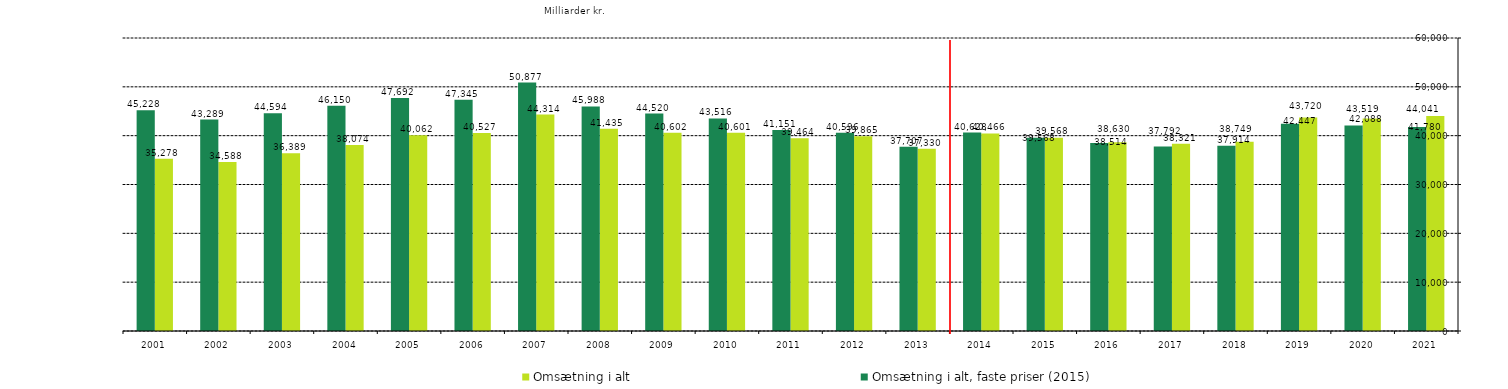
| Category | Omsætning i alt | Omsætning i alt, faste priser (2015) |
|---|---|---|
| 2021.0 | 44040.703 | 41780.048 |
| 2020.0 | 43518.684 | 42087.702 |
| 2019.0 | 43720.193 | 42446.789 |
| 2018.0 | 38748.559 | 37914.441 |
| 2017.0 | 38320.677 | 37791.595 |
| 2016.0 | 38630.023 | 38514.48 |
| 2015.0 | 39568.469 | 39568.469 |
| 2014.0 | 40465.647 | 40628.16 |
| 2013.0 | 37330.068 | 37707.139 |
| 2012.0 | 39864.928 | 40595.65 |
| 2011.0 | 39464.007 | 41151.206 |
| 2010.0 | 40600.517 | 43516.095 |
| 2009.0 | 40601.91 | 44519.638 |
| 2008.0 | 41434.892 | 45987.672 |
| 2007.0 | 44313.991 | 50877.142 |
| 2006.0 | 40527.202 | 47344.862 |
| 2005.0 | 40061.522 | 47692.288 |
| 2004.0 | 38073.875 | 46150.151 |
| 2003.0 | 36389.021 | 44594.388 |
| 2002.0 | 34587.914 | 43289.004 |
| 2001.0 | 35277.741 | 45227.873 |